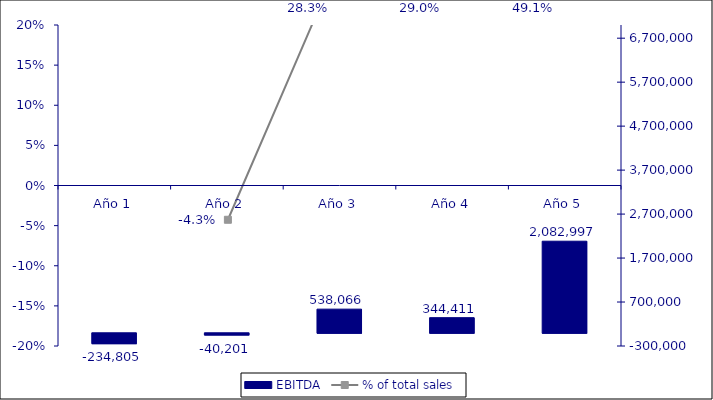
| Category | EBITDA |
|---|---|
| Año 1 | -234805.2 |
| Año 2 | -40201.07 |
| Año 3 | 538066.477 |
| Año 4 | 344411.245 |
| Año 5 | 2082997.385 |